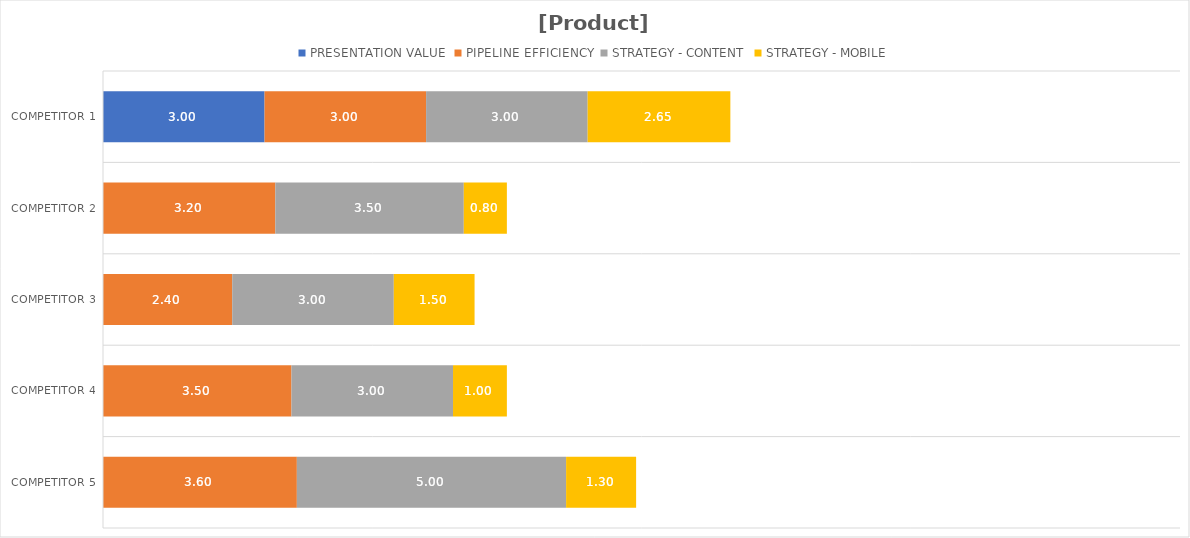
| Category | PRESENTATION VALUE | PIPELINE EFFICIENCY | STRATEGY - CONTENT | STRATEGY - MOBILE |
|---|---|---|---|---|
| Competitor 1 | 3 | 3 | 3 | 2.65 |
| Competitor 2 | 0 | 3.2 | 3.5 | 0.8 |
| Competitor 3 | 0 | 2.4 | 3 | 1.5 |
| Competitor 4 | 0 | 3.5 | 3 | 1 |
| Competitor 5 | 0 | 3.6 | 5 | 1.3 |